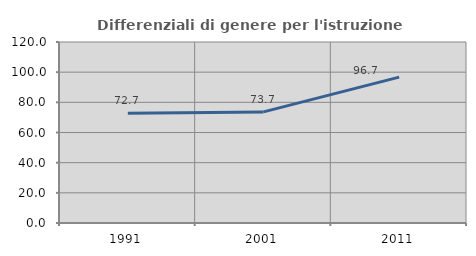
| Category | Differenziali di genere per l'istruzione superiore |
|---|---|
| 1991.0 | 72.713 |
| 2001.0 | 73.656 |
| 2011.0 | 96.706 |